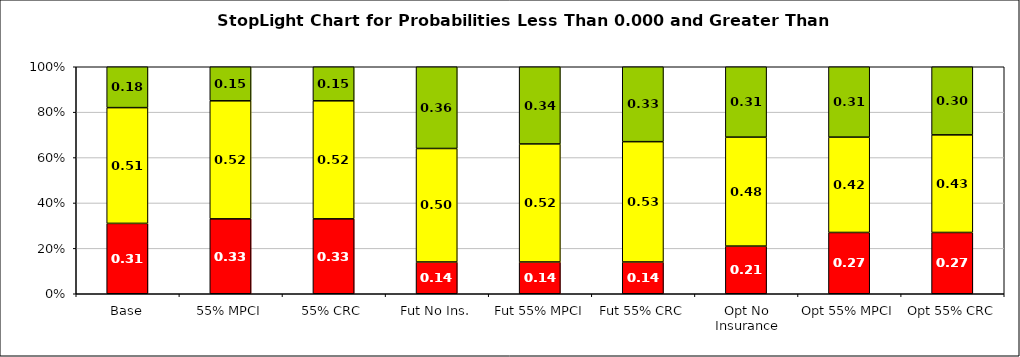
| Category | Series 0 | Series 1 | Series 2 |
|---|---|---|---|
| Base | 0.31 | 0.51 | 0.18 |
| 55% MPCI | 0.33 | 0.52 | 0.15 |
| 55% CRC | 0.33 | 0.52 | 0.15 |
| Fut No Ins. | 0.14 | 0.5 | 0.36 |
| Fut 55% MPCI | 0.14 | 0.52 | 0.34 |
| Fut 55% CRC | 0.14 | 0.53 | 0.33 |
| Opt No Insurance | 0.21 | 0.48 | 0.31 |
| Opt 55% MPCI | 0.27 | 0.42 | 0.31 |
| Opt 55% CRC | 0.27 | 0.43 | 0.3 |